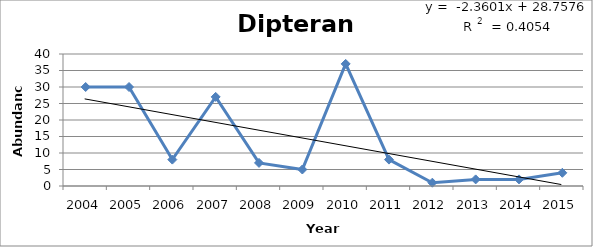
| Category | Abundance |
|---|---|
| 2004.0 | 30 |
| 2005.0 | 30 |
| 2006.0 | 8 |
| 2007.0 | 27 |
| 2008.0 | 7 |
| 2009.0 | 5 |
| 2010.0 | 37 |
| 2011.0 | 8 |
| 2012.0 | 1 |
| 2013.0 | 2 |
| 2014.0 | 2 |
| 2015.0 | 4 |